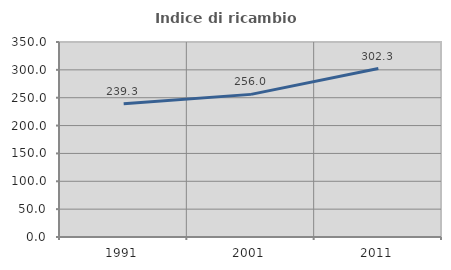
| Category | Indice di ricambio occupazionale  |
|---|---|
| 1991.0 | 239.286 |
| 2001.0 | 256 |
| 2011.0 | 302.326 |